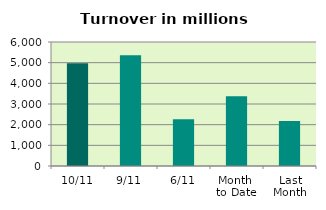
| Category | Series 0 |
|---|---|
| 10/11 | 4967.52 |
| 9/11 | 5360.052 |
| 6/11 | 2267.471 |
| Month 
to Date | 3373.382 |
| Last
Month | 2179.795 |